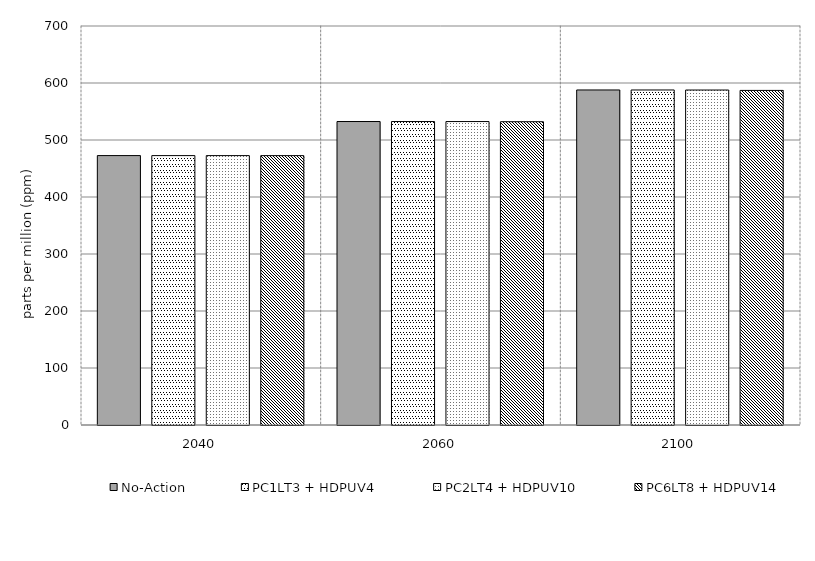
| Category | No-Action | PC1LT3 + HDPUV4 | PC2LT4 + HDPUV10 | PC6LT8 + HDPUV14 | Series 4 | Alt 5 | Alt 6 | Alt 7 | Alt 8 | Alt 10 |
|---|---|---|---|---|---|---|---|---|---|---|
| 2040.0 | 472.652 | 472.641 | 472.635 | 472.561 |  |  |  |  |  |  |
| 2060.0 | 532.404 | 532.385 | 532.354 | 532.051 |  |  |  |  |  |  |
| 2100.0 | 587.781 | 587.757 | 587.68 | 587.001 |  |  |  |  |  |  |